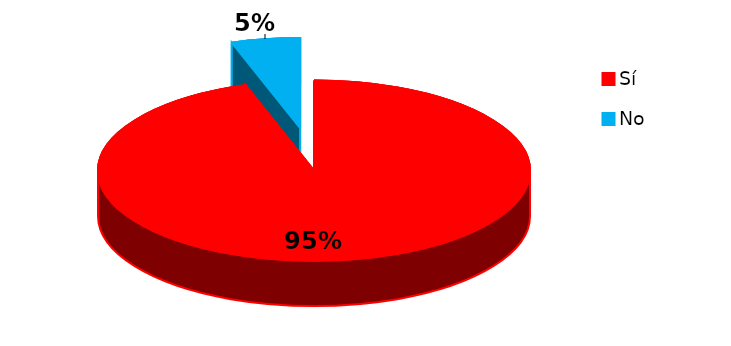
| Category | Series 0 |
|---|---|
| 0 | 37 |
| 1 | 2 |